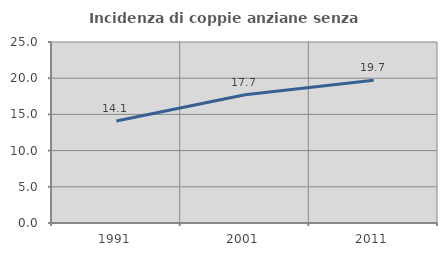
| Category | Incidenza di coppie anziane senza figli  |
|---|---|
| 1991.0 | 14.091 |
| 2001.0 | 17.703 |
| 2011.0 | 19.722 |